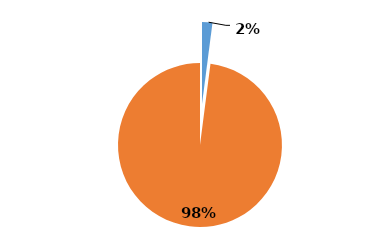
| Category | Unites States Vs |
|---|---|
| 0 | 6468907 |
| 1 | 310212755 |